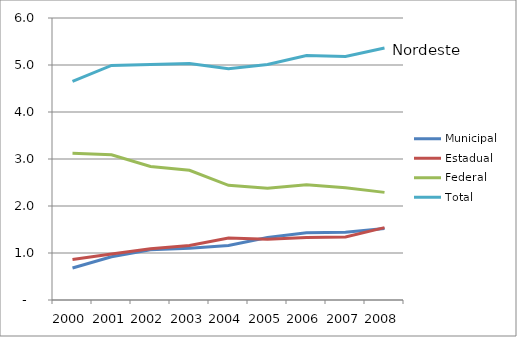
| Category | Municipal | Estadual | Federal | Total |
|---|---|---|---|---|
| 2000.0 | 0.68 | 0.86 | 3.12 | 4.65 |
| 2001.0 | 0.92 | 0.98 | 3.09 | 4.99 |
| 2002.0 | 1.07 | 1.09 | 2.84 | 5.01 |
| 2003.0 | 1.1 | 1.16 | 2.76 | 5.03 |
| 2004.0 | 1.16 | 1.32 | 2.44 | 4.92 |
| 2005.0 | 1.33 | 1.29 | 2.38 | 5.01 |
| 2006.0 | 1.43 | 1.33 | 2.45 | 5.2 |
| 2007.0 | 1.44 | 1.34 | 2.39 | 5.18 |
| 2008.0 | 1.52 | 1.54 | 2.29 | 5.36 |